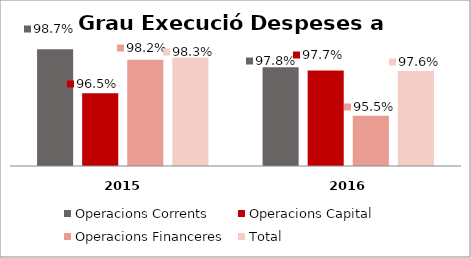
| Category | Operacions Corrents | Operacions Capital | Operacions Financeres | Total |
|---|---|---|---|---|
| 0 | 0.987 | 0.965 | 0.982 | 0.983 |
| 1 | 0.978 | 0.977 | 0.955 | 0.976 |